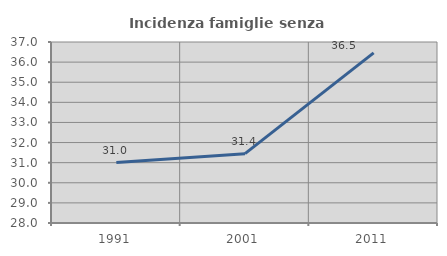
| Category | Incidenza famiglie senza nuclei |
|---|---|
| 1991.0 | 31.004 |
| 2001.0 | 31.446 |
| 2011.0 | 36.46 |